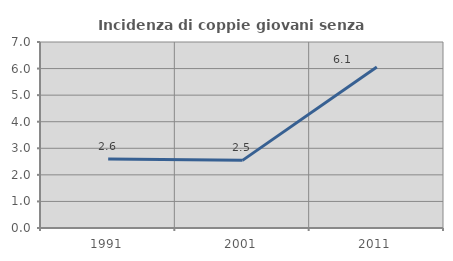
| Category | Incidenza di coppie giovani senza figli |
|---|---|
| 1991.0 | 2.597 |
| 2001.0 | 2.545 |
| 2011.0 | 6.061 |